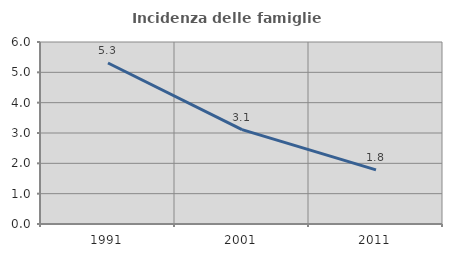
| Category | Incidenza delle famiglie numerose |
|---|---|
| 1991.0 | 5.307 |
| 2001.0 | 3.111 |
| 2011.0 | 1.784 |